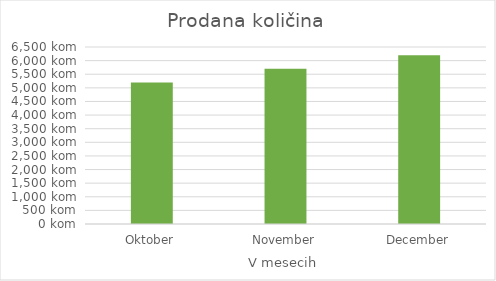
| Category | Prodana količina |
|---|---|
| Oktober | 5200 |
| November | 5700 |
| December | 6200 |